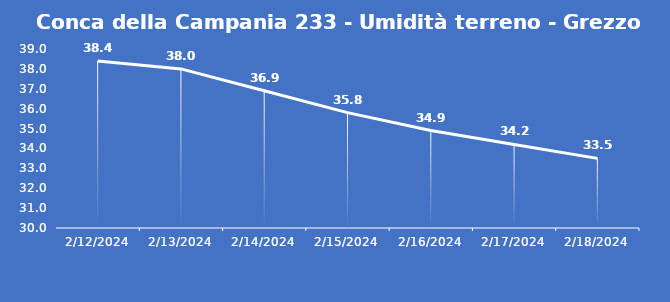
| Category | Conca della Campania 233 - Umidità terreno - Grezzo (%VWC) |
|---|---|
| 2/12/24 | 38.4 |
| 2/13/24 | 38 |
| 2/14/24 | 36.9 |
| 2/15/24 | 35.8 |
| 2/16/24 | 34.9 |
| 2/17/24 | 34.2 |
| 2/18/24 | 33.5 |